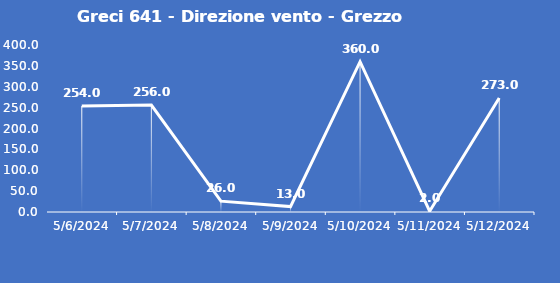
| Category | Greci 641 - Direzione vento - Grezzo (°N) |
|---|---|
| 5/6/24 | 254 |
| 5/7/24 | 256 |
| 5/8/24 | 26 |
| 5/9/24 | 13 |
| 5/10/24 | 360 |
| 5/11/24 | 2 |
| 5/12/24 | 273 |